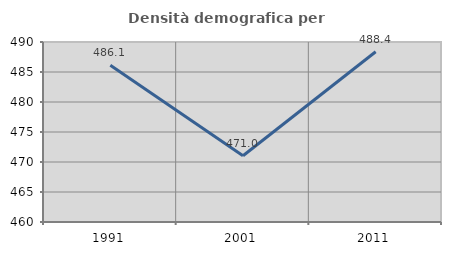
| Category | Densità demografica |
|---|---|
| 1991.0 | 486.123 |
| 2001.0 | 471.048 |
| 2011.0 | 488.383 |